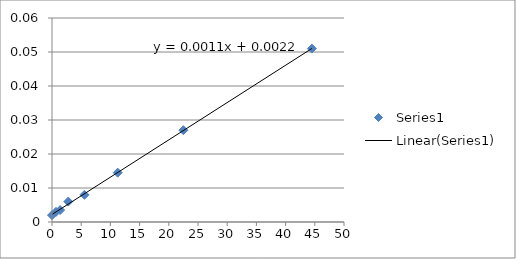
| Category | Series 0 |
|---|---|
| 0.0 | 0.002 |
| 0.69 | 0.003 |
| 1.39 | 0.004 |
| 2.78 | 0.006 |
| 5.56 | 0.008 |
| 11.25 | 0.014 |
| 22.5 | 0.027 |
| 44.5 | 0.051 |